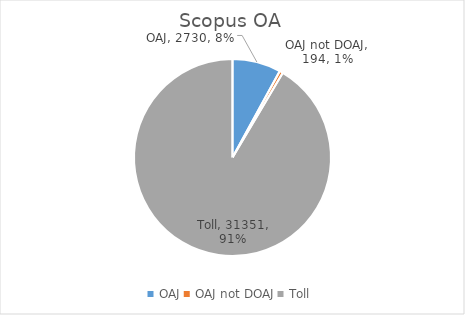
| Category | Series 0 |
|---|---|
| OAJ | 2730 |
| OAJ not DOAJ | 194 |
| Toll | 31351 |